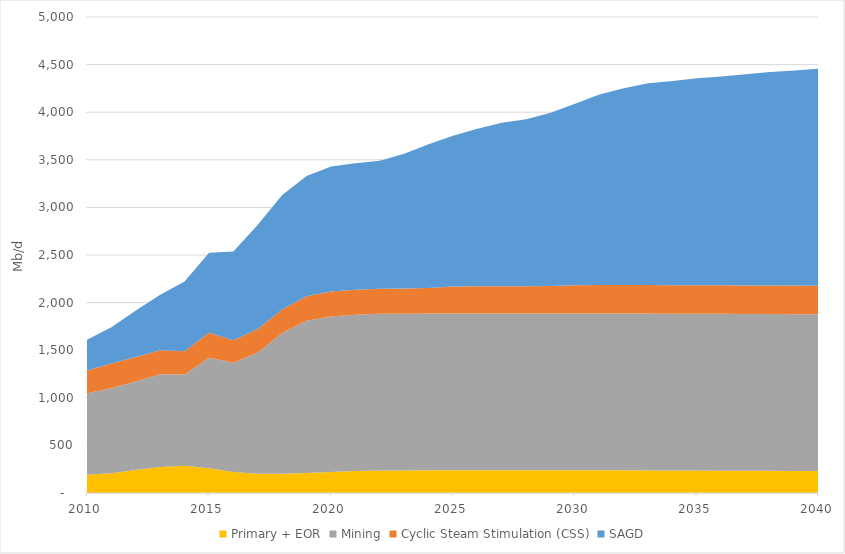
| Category | Primary + EOR | Mining | Cyclic Steam Stimulation (CSS) | SAGD |
|---|---|---|---|---|
| 2010.0 | 190.798 | 856.462 | 238.583 | 322.842 |
| 2011.0 | 206.794 | 893.004 | 261.05 | 379.252 |
| 2012.0 | 240.87 | 929.253 | 259.34 | 486.809 |
| 2013.0 | 272.271 | 975.92 | 252.42 | 581.29 |
| 2014.0 | 285.019 | 960.615 | 242.651 | 734.513 |
| 2015.0 | 259.364 | 1160.998 | 263.168 | 839.277 |
| 2016.0 | 220.481 | 1146.924 | 237.009 | 932.606 |
| 2017.0 | 201.289 | 1275.671 | 245.971 | 1095.19 |
| 2018.0 | 203.433 | 1476.844 | 247.658 | 1201.782 |
| 2019.0 | 209.884 | 1598.594 | 258.344 | 1263.98 |
| 2020.0 | 220.38 | 1632.944 | 263.551 | 1312.241 |
| 2021.0 | 230.789 | 1641.78 | 263.55 | 1327.876 |
| 2022.0 | 235.557 | 1646.837 | 263.547 | 1345.375 |
| 2023.0 | 237.268 | 1646.837 | 263.544 | 1416.261 |
| 2024.0 | 238.291 | 1646.837 | 269.271 | 1507.885 |
| 2025.0 | 238.912 | 1646.837 | 283.123 | 1582.473 |
| 2026.0 | 239.044 | 1646.837 | 286.037 | 1654.979 |
| 2027.0 | 239.035 | 1646.837 | 286.035 | 1716.8 |
| 2028.0 | 239.027 | 1646.837 | 286.034 | 1753.778 |
| 2029.0 | 239.019 | 1646.837 | 289.47 | 1819.599 |
| 2030.0 | 238.739 | 1646.837 | 297.781 | 1906.314 |
| 2031.0 | 238.428 | 1646.837 | 299.53 | 2000.844 |
| 2032.0 | 238.111 | 1646.837 | 299.528 | 2067.687 |
| 2033.0 | 237.523 | 1646.837 | 299.527 | 2119.426 |
| 2034.0 | 236.638 | 1646.837 | 299.527 | 2144.256 |
| 2035.0 | 235.719 | 1646.837 | 299.526 | 2173.328 |
| 2036.0 | 234.798 | 1646.837 | 299.525 | 2193.502 |
| 2037.0 | 233.882 | 1646.837 | 299.524 | 2218.019 |
| 2038.0 | 232.97 | 1646.837 | 299.524 | 2241.776 |
| 2039.0 | 232.064 | 1646.837 | 299.523 | 2260.846 |
| 2040.0 | 231.163 | 1646.837 | 299.523 | 2280.15 |